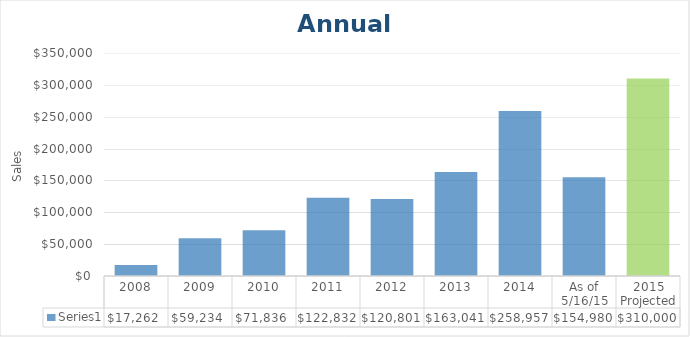
| Category | Series 0 |
|---|---|
| 2008 | 17262 |
| 2009 | 59234 |
| 2010 | 71836 |
| 2011 | 122832 |
| 2012 | 120801 |
| 2013 | 163041 |
| 2014 | 258957 |
| As of 5/16/15 | 154980 |
| 2015 Projected | 310000 |